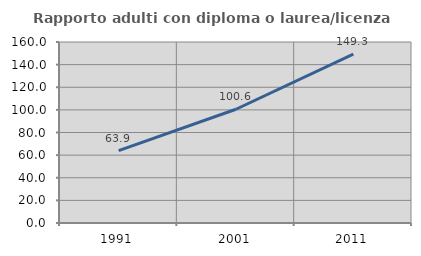
| Category | Rapporto adulti con diploma o laurea/licenza media  |
|---|---|
| 1991.0 | 63.942 |
| 2001.0 | 100.558 |
| 2011.0 | 149.273 |